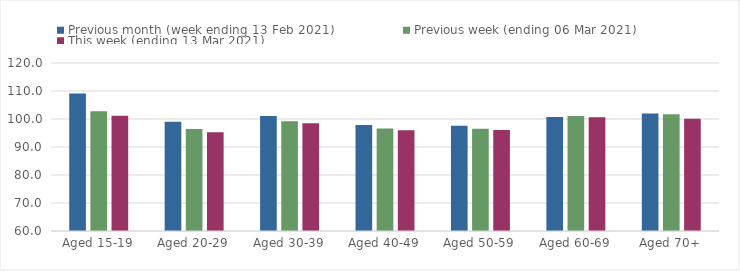
| Category | Previous month (week ending 13 Feb 2021) | Previous week (ending 06 Mar 2021) | This week (ending 13 Mar 2021) |
|---|---|---|---|
| Aged 15-19 | 109.14 | 102.78 | 101.18 |
| Aged 20-29 | 98.99 | 96.4 | 95.23 |
| Aged 30-39 | 101.03 | 99.21 | 98.49 |
| Aged 40-49 | 97.86 | 96.62 | 95.95 |
| Aged 50-59 | 97.61 | 96.55 | 96.03 |
| Aged 60-69 | 100.74 | 101.11 | 100.65 |
| Aged 70+ | 101.95 | 101.73 | 100.13 |